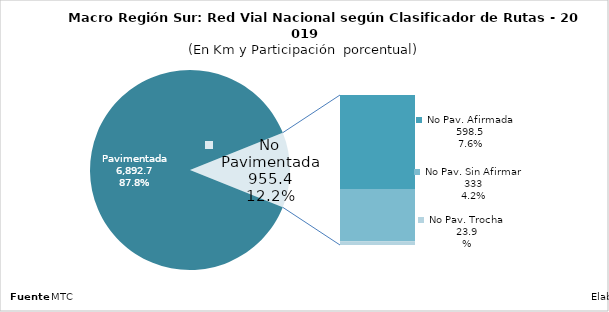
| Category | Series 0 |
|---|---|
| Pavimentada | 6892.739 |
| No Pavimentada                   Afirmada | 598.463 |
| No Pavimentada                   Sin Afirmar | 333.018 |
| No Pavimentada                            Trocha | 23.927 |